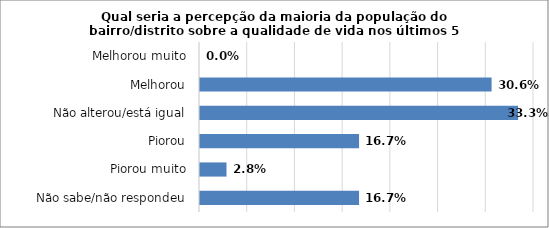
| Category | Series 0 |
|---|---|
| Não sabe/não respondeu | 0.167 |
| Piorou muito | 0.028 |
| Piorou | 0.167 |
| Não alterou/está igual | 0.333 |
| Melhorou | 0.306 |
| Melhorou muito | 0 |